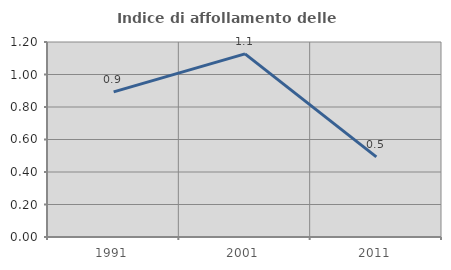
| Category | Indice di affollamento delle abitazioni  |
|---|---|
| 1991.0 | 0.893 |
| 2001.0 | 1.127 |
| 2011.0 | 0.493 |